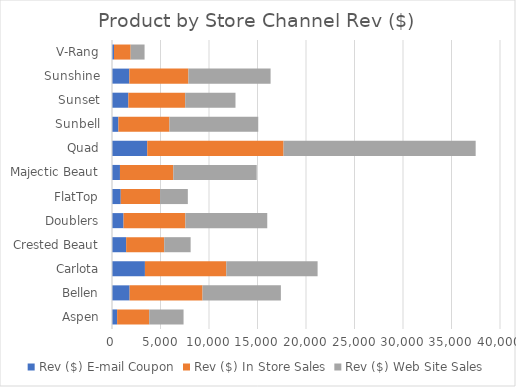
| Category | Rev ($) |
|---|---|
| Aspen | 3542.59 |
| Bellen | 8075.36 |
| Carlota | 9410.38 |
| Crested Beaut | 2721.39 |
| Doublers | 8439.76 |
| FlatTop | 2864.12 |
| Majectic Beaut | 8595.65 |
| Quad | 19803.54 |
| Sunbell | 9154.37 |
| Sunset | 5184.85 |
| Sunshine | 8470.9 |
| V-Rang | 1431.55 |